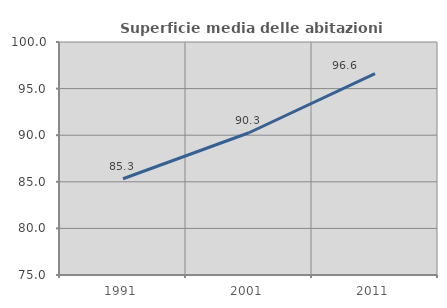
| Category | Superficie media delle abitazioni occupate |
|---|---|
| 1991.0 | 85.329 |
| 2001.0 | 90.264 |
| 2011.0 | 96.604 |